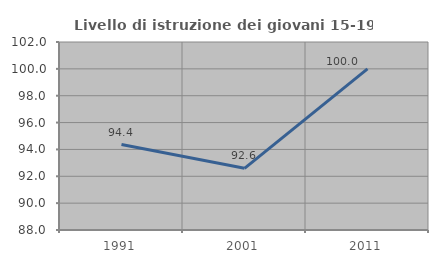
| Category | Livello di istruzione dei giovani 15-19 anni |
|---|---|
| 1991.0 | 94.366 |
| 2001.0 | 92.593 |
| 2011.0 | 100 |